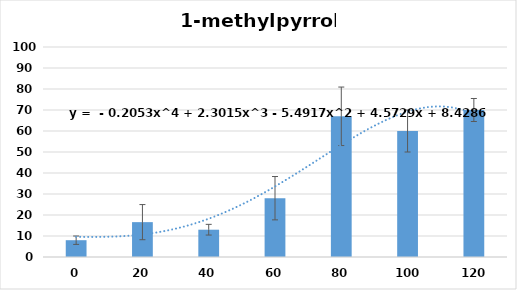
| Category | Series 0 |
|---|---|
| 0.0 | 8 |
| 20.0 | 16.6 |
| 40.0 | 13 |
| 60.0 | 28 |
| 80.0 | 67 |
| 100.0 | 60 |
| 120.0 | 70 |